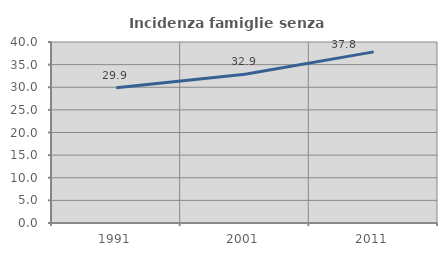
| Category | Incidenza famiglie senza nuclei |
|---|---|
| 1991.0 | 29.912 |
| 2001.0 | 32.891 |
| 2011.0 | 37.822 |